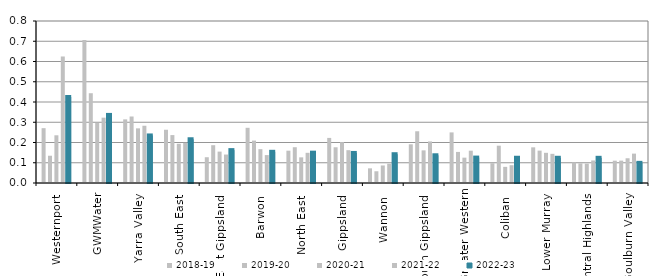
| Category | 2018-19 | 2019-20 | 2020-21 | 2021-22 | 2022-23 |
|---|---|---|---|---|---|
| Westernport  | 0.271 | 0.135 | 0.236 | 0.625 | 0.425 |
| GWMWater | 0.706 | 0.443 | 0.297 | 0.323 | 0.336 |
| Yarra Valley  | 0.314 | 0.328 | 0.27 | 0.283 | 0.235 |
| South East  | 0.263 | 0.237 | 0.194 | 0.198 | 0.216 |
| East Gippsland  | 0.127 | 0.187 | 0.155 | 0.141 | 0.162 |
| Barwon  | 0.273 | 0.209 | 0.167 | 0.138 | 0.154 |
| North East  | 0.16 | 0.177 | 0.127 | 0.149 | 0.15 |
| Gippsland  | 0.223 | 0.176 | 0.202 | 0.162 | 0.148 |
| Wannon  | 0.072 | 0.058 | 0.087 | 0.095 | 0.142 |
| South Gippsland  | 0.191 | 0.255 | 0.161 | 0.205 | 0.137 |
| Greater Western | 0.25 | 0.153 | 0.125 | 0.16 | 0.126 |
| Coliban  | 0.098 | 0.184 | 0.08 | 0.088 | 0.125 |
| Lower Murray  | 0.176 | 0.16 | 0.149 | 0.144 | 0.125 |
| Central Highlands  | 0.102 | 0.097 | 0.096 | 0.111 | 0.124 |
| Goulburn Valley  | 0.11 | 0.11 | 0.122 | 0.145 | 0.099 |